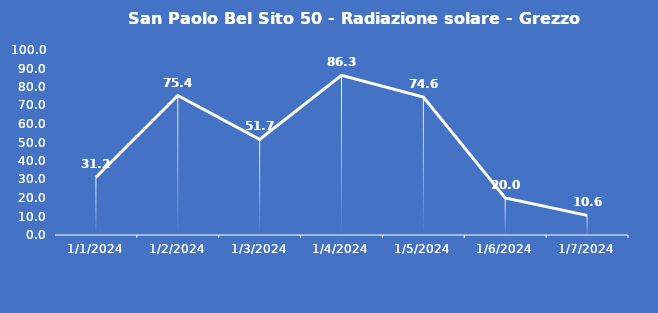
| Category | San Paolo Bel Sito 50 - Radiazione solare - Grezzo (W/m2) |
|---|---|
| 1/1/24 | 31.2 |
| 1/2/24 | 75.4 |
| 1/3/24 | 51.7 |
| 1/4/24 | 86.3 |
| 1/5/24 | 74.6 |
| 1/6/24 | 20 |
| 1/7/24 | 10.6 |